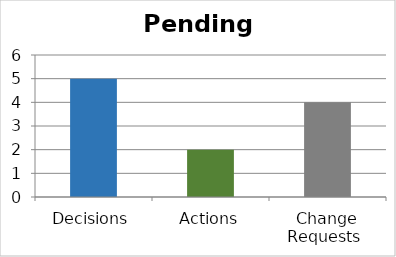
| Category | Series 0 |
|---|---|
| Decisions | 5 |
| Actions | 2 |
| Change Requests  | 4 |